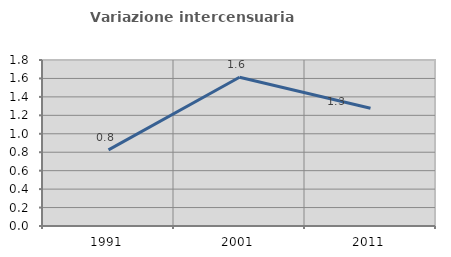
| Category | Variazione intercensuaria annua |
|---|---|
| 1991.0 | 0.825 |
| 2001.0 | 1.613 |
| 2011.0 | 1.278 |